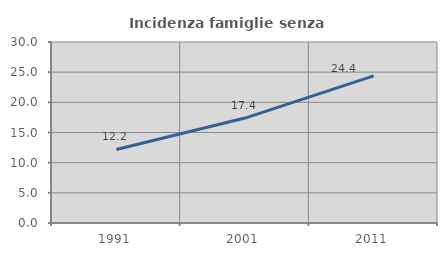
| Category | Incidenza famiglie senza nuclei |
|---|---|
| 1991.0 | 12.195 |
| 2001.0 | 17.391 |
| 2011.0 | 24.38 |